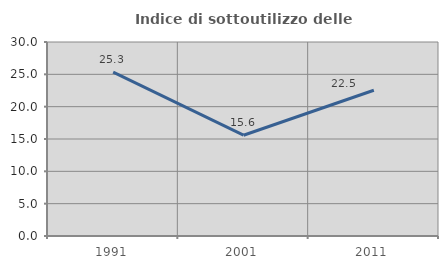
| Category | Indice di sottoutilizzo delle abitazioni  |
|---|---|
| 1991.0 | 25.333 |
| 2001.0 | 15.584 |
| 2011.0 | 22.535 |